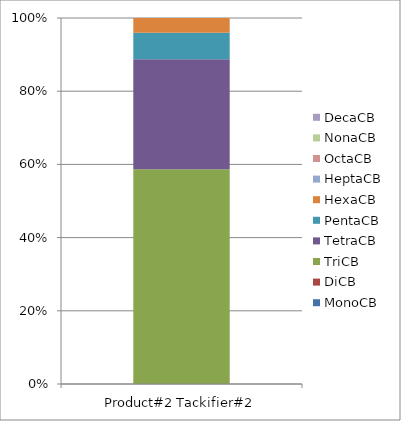
| Category | MonoCB | DiCB | TriCB | TetraCB | PentaCB | HexaCB | HeptaCB | OctaCB | NonaCB | DecaCB |
|---|---|---|---|---|---|---|---|---|---|---|
| 0 |  |  | 2.87 | 1.47 | 0.352 | 0.198 |  |  |  |  |